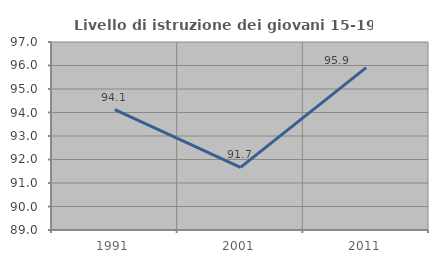
| Category | Livello di istruzione dei giovani 15-19 anni |
|---|---|
| 1991.0 | 94.118 |
| 2001.0 | 91.667 |
| 2011.0 | 95.909 |